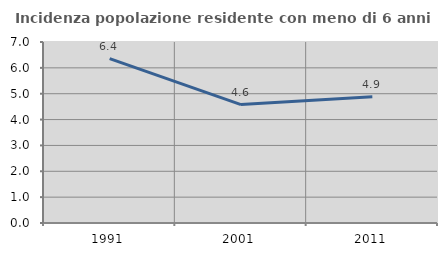
| Category | Incidenza popolazione residente con meno di 6 anni |
|---|---|
| 1991.0 | 6.359 |
| 2001.0 | 4.58 |
| 2011.0 | 4.878 |